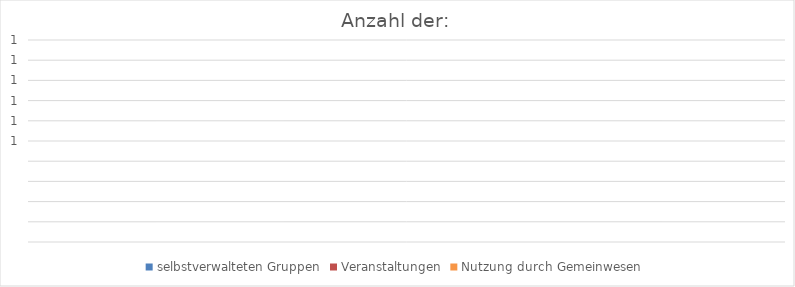
| Category | selbstverwalteten Gruppen | Veranstaltungen | Nutzung durch Gemeinwesen  |
|---|---|---|---|
| 0 | 0 | 0 | 0 |